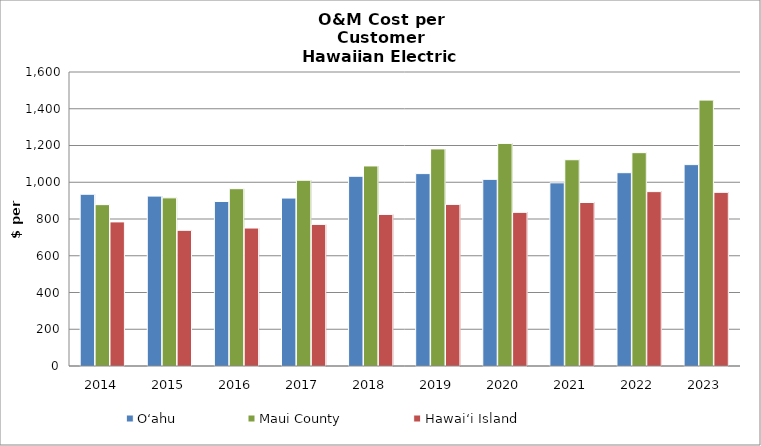
| Category | Oʻahu | Maui County | Hawai‘i Island |
|---|---|---|---|
| 2014.0 | 934.688 | 878.168 | 784.233 |
| 2015.0 | 924.619 | 915.021 | 738.346 |
| 2016.0 | 895.407 | 964.964 | 750.796 |
| 2017.0 | 913.878 | 1010.724 | 770.582 |
| 2018.0 | 1032.485 | 1088.652 | 824.747 |
| 2019.0 | 1047.063 | 1181.389 | 879.468 |
| 2020.0 | 1015.692 | 1211.342 | 836.121 |
| 2021.0 | 996.85 | 1122.474 | 889.73 |
| 2022.0 | 1052 | 1161 | 949 |
| 2023.0 | 1096 | 1447 | 945 |